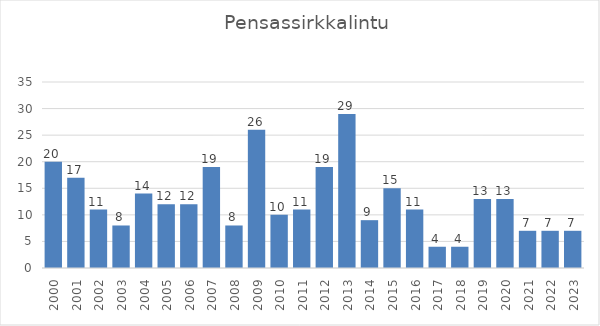
| Category | Series 0 |
|---|---|
| 2000.0 | 20 |
| 2001.0 | 17 |
| 2002.0 | 11 |
| 2003.0 | 8 |
| 2004.0 | 14 |
| 2005.0 | 12 |
| 2006.0 | 12 |
| 2007.0 | 19 |
| 2008.0 | 8 |
| 2009.0 | 26 |
| 2010.0 | 10 |
| 2011.0 | 11 |
| 2012.0 | 19 |
| 2013.0 | 29 |
| 2014.0 | 9 |
| 2015.0 | 15 |
| 2016.0 | 11 |
| 2017.0 | 4 |
| 2018.0 | 4 |
| 2019.0 | 13 |
| 2020.0 | 13 |
| 2021.0 | 7 |
| 2022.0 | 7 |
| 2023.0 | 7 |